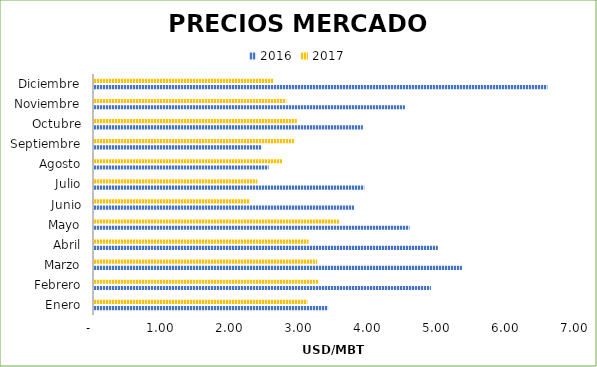
| Category | 2016 | 2017 |
|---|---|---|
| Enero | 3.4 | 3.099 |
| Febrero | 4.894 | 3.259 |
| Marzo | 5.344 | 3.24 |
| Abril | 4.993 | 3.117 |
| Mayo | 4.582 | 3.563 |
| Junio | 3.777 | 2.267 |
| Julio | 3.925 | 2.372 |
| Agosto | 2.536 | 2.731 |
| Septiembre | 2.435 | 2.912 |
| Octubre | 3.906 | 2.945 |
| Noviembre | 4.515 | 2.793 |
| Diciembre | 6.585 | 2.612 |